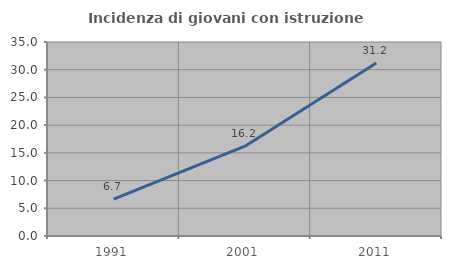
| Category | Incidenza di giovani con istruzione universitaria |
|---|---|
| 1991.0 | 6.667 |
| 2001.0 | 16.197 |
| 2011.0 | 31.193 |